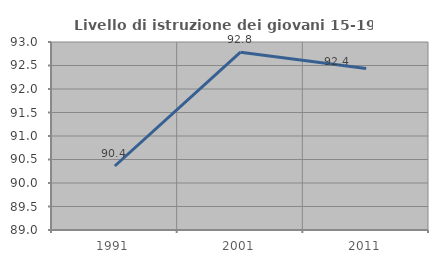
| Category | Livello di istruzione dei giovani 15-19 anni |
|---|---|
| 1991.0 | 90.361 |
| 2001.0 | 92.784 |
| 2011.0 | 92.437 |